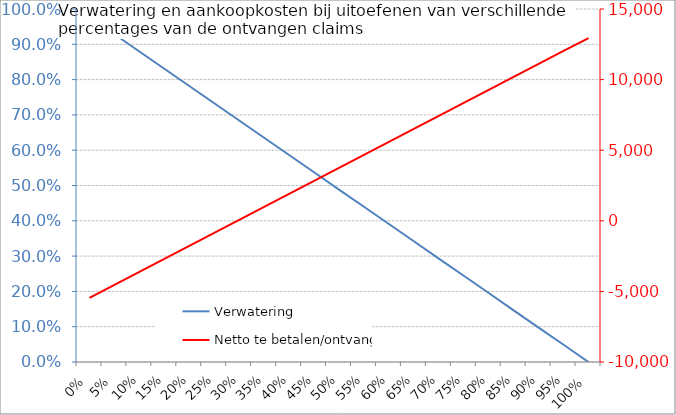
| Category | Verwatering |
|---|---|
| 0.0 | 0.977 |
| 0.05 | 0.928 |
| 0.1 | 0.879 |
| 0.15 | 0.831 |
| 0.2 | 0.782 |
| 0.25 | 0.733 |
| 0.3 | 0.684 |
| 0.35 | 0.635 |
| 0.4 | 0.586 |
| 0.45 | 0.537 |
| 0.5 | 0.489 |
| 0.55 | 0.44 |
| 0.6 | 0.391 |
| 0.65 | 0.342 |
| 0.7 | 0.293 |
| 0.75 | 0.244 |
| 0.8 | 0.195 |
| 0.85 | 0.146 |
| 0.9 | 0.098 |
| 0.95 | 0.049 |
| 1.0 | 0 |